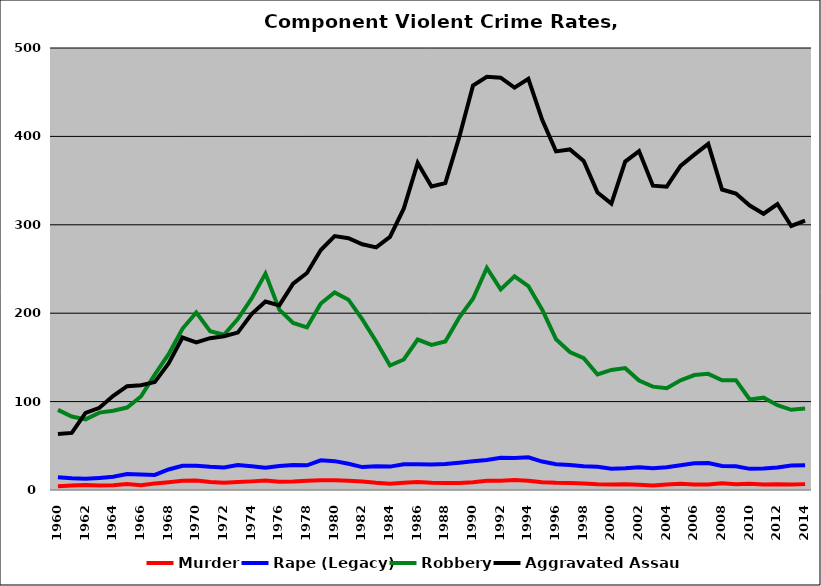
| Category | Murder | Rape (Legacy) | Robbery | Aggravated Assault |
|---|---|---|---|---|
| 1960.0 | 4.375 | 14.515 | 90.583 | 63.406 |
| 1961.0 | 5.094 | 13.202 | 83.074 | 64.596 |
| 1962.0 | 5.545 | 12.609 | 79.936 | 87.345 |
| 1963.0 | 5.152 | 13.678 | 87.523 | 93.022 |
| 1964.0 | 5.443 | 14.992 | 89.703 | 106.532 |
| 1965.0 | 6.671 | 18.056 | 93.284 | 117.434 |
| 1966.0 | 5.435 | 17.591 | 105.79 | 118.5 |
| 1967.0 | 7.321 | 17.054 | 130.458 | 122.073 |
| 1968.0 | 8.818 | 23.255 | 153.62 | 143.16 |
| 1969.0 | 10.428 | 27.306 | 182.391 | 172.479 |
| 1970.0 | 10.668 | 27.43 | 200.817 | 166.995 |
| 1971.0 | 8.928 | 26.216 | 179.68 | 171.72 |
| 1972.0 | 8.332 | 25.5 | 175.615 | 173.953 |
| 1973.0 | 8.976 | 28.211 | 193.42 | 178.074 |
| 1974.0 | 9.755 | 26.9 | 216.726 | 199.037 |
| 1975.0 | 10.603 | 25.194 | 244.741 | 213.29 |
| 1976.0 | 9.272 | 27.124 | 204.06 | 208.895 |
| 1977.0 | 9.623 | 28.307 | 189.044 | 233.451 |
| 1978.0 | 10.391 | 27.984 | 184.012 | 245.473 |
| 1979.0 | 11.154 | 33.648 | 210.908 | 271.446 |
| 1980.0 | 11.099 | 32.644 | 223.574 | 287.169 |
| 1981.0 | 10.45 | 29.668 | 215.249 | 284.832 |
| 1982.0 | 9.675 | 25.914 | 192.971 | 277.964 |
| 1983.0 | 8.109 | 26.761 | 167.928 | 274.427 |
| 1984.0 | 7.149 | 26.458 | 140.835 | 286.242 |
| 1985.0 | 8.133 | 29.191 | 147.644 | 318.533 |
| 1986.0 | 9.159 | 29.214 | 170.233 | 369.957 |
| 1987.0 | 8.289 | 28.865 | 164.139 | 343.327 |
| 1988.0 | 8.037 | 29.286 | 168.087 | 347.091 |
| 1989.0 | 7.928 | 30.762 | 194.999 | 398.876 |
| 1990.0 | 8.775 | 32.499 | 216.393 | 457.625 |
| 1991.0 | 10.527 | 34.044 | 251.105 | 467.371 |
| 1992.0 | 10.533 | 36.491 | 226.902 | 466.455 |
| 1993.0 | 11.272 | 36.186 | 241.765 | 455.197 |
| 1994.0 | 10.496 | 37.041 | 230.731 | 465.195 |
| 1995.0 | 8.809 | 32.137 | 204.038 | 418.783 |
| 1996.0 | 8.08 | 29.222 | 170.592 | 383.057 |
| 1997.0 | 7.886 | 28.23 | 156.053 | 385.246 |
| 1998.0 | 7.336 | 26.898 | 149.219 | 372.201 |
| 1999.0 | 6.565 | 26.315 | 130.734 | 336.592 |
| 2000.0 | 6.202 | 24.146 | 135.795 | 323.902 |
| 2001.0 | 6.599 | 24.533 | 137.849 | 371.56 |
| 2002.0 | 5.838 | 25.84 | 123.89 | 383.399 |
| 2003.0 | 5.053 | 24.479 | 116.904 | 344.314 |
| 2004.0 | 6.146 | 25.679 | 115.114 | 343.136 |
| 2005.0 | 6.934 | 28.028 | 124.118 | 366.593 |
| 2006.0 | 6.333 | 30.209 | 130.025 | 379.361 |
| 2007.0 | 6.243 | 30.399 | 131.362 | 391.602 |
| 2008.0 | 7.656 | 27.097 | 124.17 | 339.89 |
| 2009.0 | 6.463 | 26.822 | 124.207 | 335.411 |
| 2010.0 | 7.013 | 23.911 | 102.389 | 321.727 |
| 2011.0 | 6.091 | 24.447 | 104.427 | 312.499 |
| 2012.0 | 6.474 | 25.346 | 95.974 | 323.511 |
| 2013.0 | 6.104 | 27.775 | 90.754 | 298.697 |
| 2014.0 | 6.646 | 28.135 | 92.223 | 304.803 |